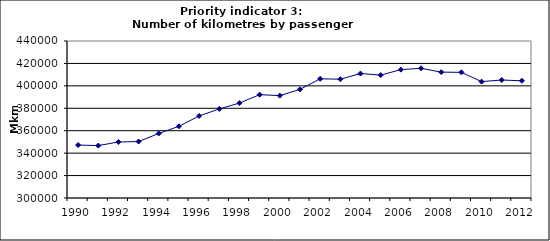
| Category | Number of kilometres by passenger cars, Mkm |
|---|---|
| 1990 | 347191.509 |
| 1991 | 346734.1 |
| 1992 | 349945.498 |
| 1993 | 350342.137 |
| 1994 | 357568.158 |
| 1995 | 363962.77 |
| 1996 | 373162.828 |
| 1997 | 379435.235 |
| 1998 | 384632.771 |
| 1999 | 392144.734 |
| 2000 | 391281.475 |
| 2001 | 396869.58 |
| 2002 | 406275.508 |
| 2003 | 405936.655 |
| 2004 | 410980.858 |
| 2005 | 409591.444 |
| 2006 | 414467.381 |
| 2007 | 415667.21 |
| 2008 | 412238.374 |
| 2009 | 412048.303 |
| 2010 | 403783.086 |
| 2011 | 405217.904 |
| 2012 | 404531.267 |